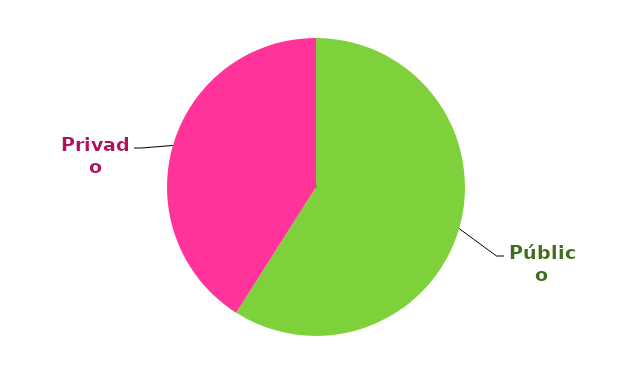
| Category | Desarrollo Urbano |
|---|---|
| Público | 4.194 |
| Privado | 2.915 |